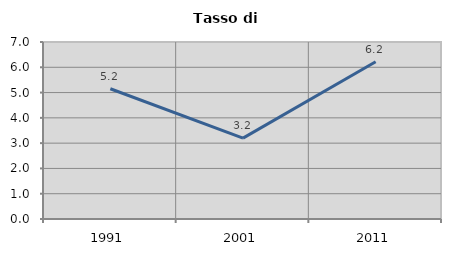
| Category | Tasso di disoccupazione   |
|---|---|
| 1991.0 | 5.15 |
| 2001.0 | 3.199 |
| 2011.0 | 6.216 |